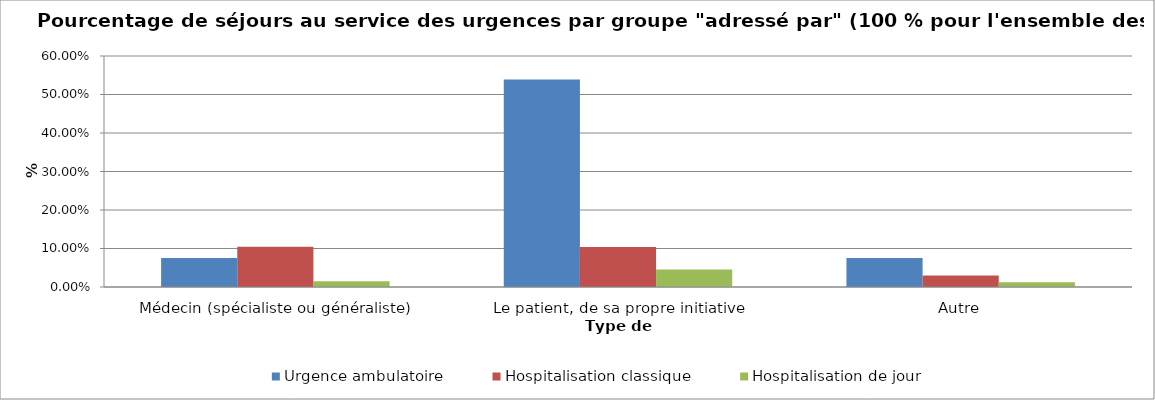
| Category | Urgence ambulatoire | Hospitalisation classique | Hospitalisation de jour |
|---|---|---|---|
| Médecin (spécialiste ou généraliste) | 0.075 | 0.104 | 0.015 |
| Le patient, de sa propre initiative | 0.539 | 0.104 | 0.045 |
| Autre | 0.075 | 0.03 | 0.012 |